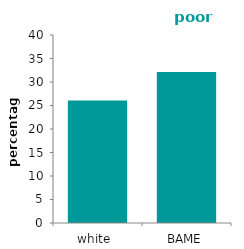
| Category | poor housing |
|---|---|
| white  | 26.055 |
| BAME | 32.127 |